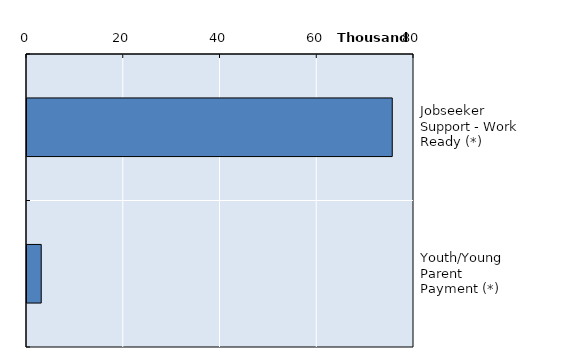
| Category | Series 0 |
|---|---|
| Jobseeker Support - Work Ready (*) | 75504 |
| Youth/Young Parent Payment (*) | 2940 |